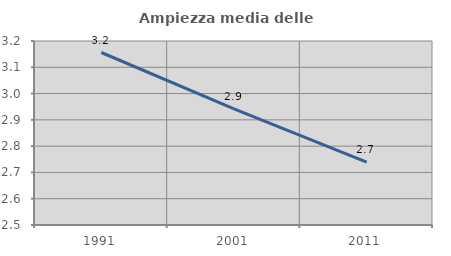
| Category | Ampiezza media delle famiglie |
|---|---|
| 1991.0 | 3.156 |
| 2001.0 | 2.942 |
| 2011.0 | 2.739 |